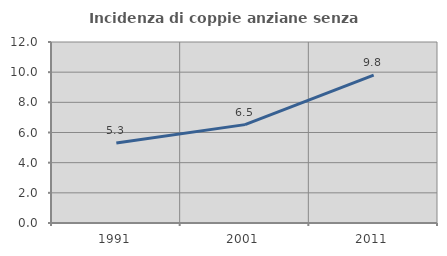
| Category | Incidenza di coppie anziane senza figli  |
|---|---|
| 1991.0 | 5.305 |
| 2001.0 | 6.522 |
| 2011.0 | 9.797 |